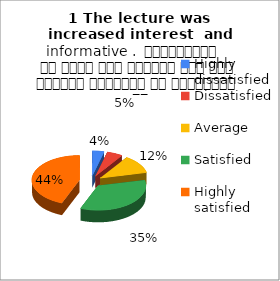
| Category | 1 The lecture was  increased interest  and informative .  व्याख्यान से रुचि में वृद्धि हुई एवं शिक्षण जानकारी से परिपूर्ण था |
|---|---|
| Highly dissatisfied | 3 |
| Dissatisfied | 4 |
| Average | 9 |
| Satisfied | 26 |
| Highly satisfied | 33 |